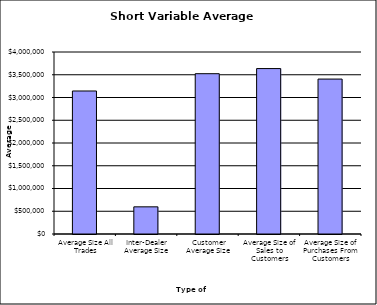
| Category | Security Type |
|---|---|
| Average Size All Trades | 3142921.998 |
| Inter-Dealer Average Size | 597124.754 |
| Customer Average Size | 3523145.954 |
| Average Size of Sales to Customers | 3635877.201 |
| Average Size of Purchases From Customers | 3404943.107 |